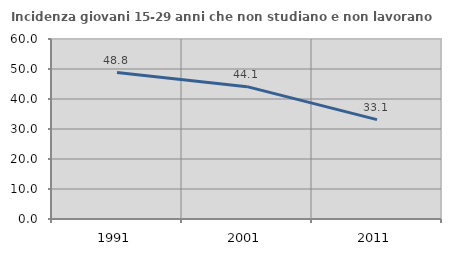
| Category | Incidenza giovani 15-29 anni che non studiano e non lavorano  |
|---|---|
| 1991.0 | 48.81 |
| 2001.0 | 44.118 |
| 2011.0 | 33.121 |